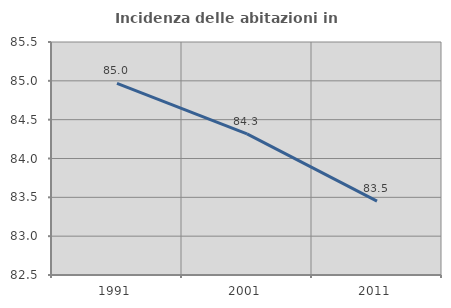
| Category | Incidenza delle abitazioni in proprietà  |
|---|---|
| 1991.0 | 84.966 |
| 2001.0 | 84.318 |
| 2011.0 | 83.451 |